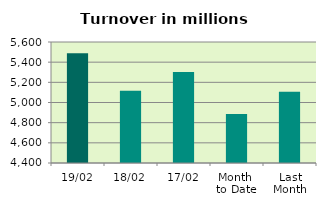
| Category | Series 0 |
|---|---|
| 19/02 | 5488.86 |
| 18/02 | 5117.654 |
| 17/02 | 5301.832 |
| Month 
to Date | 4885.002 |
| Last
Month | 5105.691 |